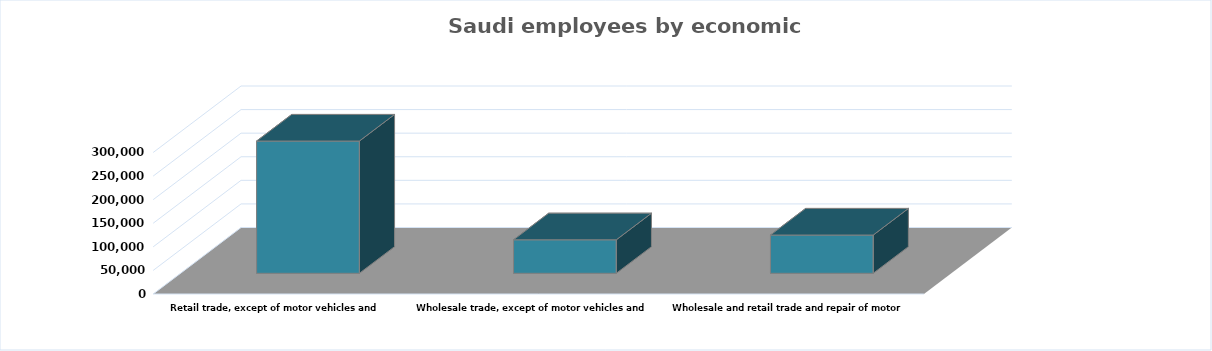
| Category | Series 0 |
|---|---|
| Wholesale and retail trade and repair of motor vehicles and motorcycles | 81129 |
| Wholesale trade, except of motor vehicles and motorcycles | 71050 |
| Retail trade, except of motor vehicles and motorcycles | 280398 |